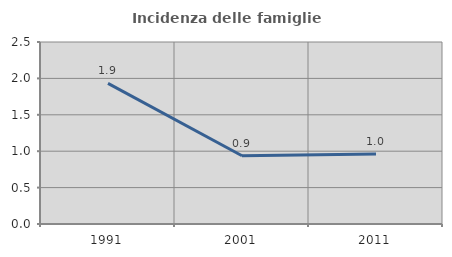
| Category | Incidenza delle famiglie numerose |
|---|---|
| 1991.0 | 1.931 |
| 2001.0 | 0.938 |
| 2011.0 | 0.962 |